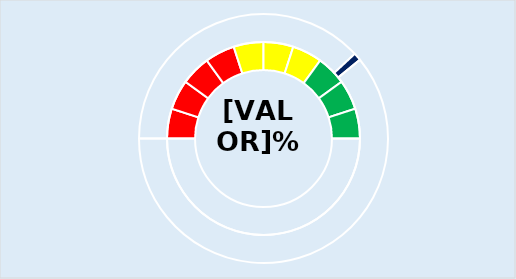
| Category | Series 0 |
|---|---|
| 0 | 10 |
| 1 | 10 |
| 2 | 10 |
| 3 | 10 |
| 4 | 10 |
| 5 | 10 |
| 6 | 10 |
| 7 | 10 |
| 8 | 10 |
| 9 | 10 |
| 10 | 100 |